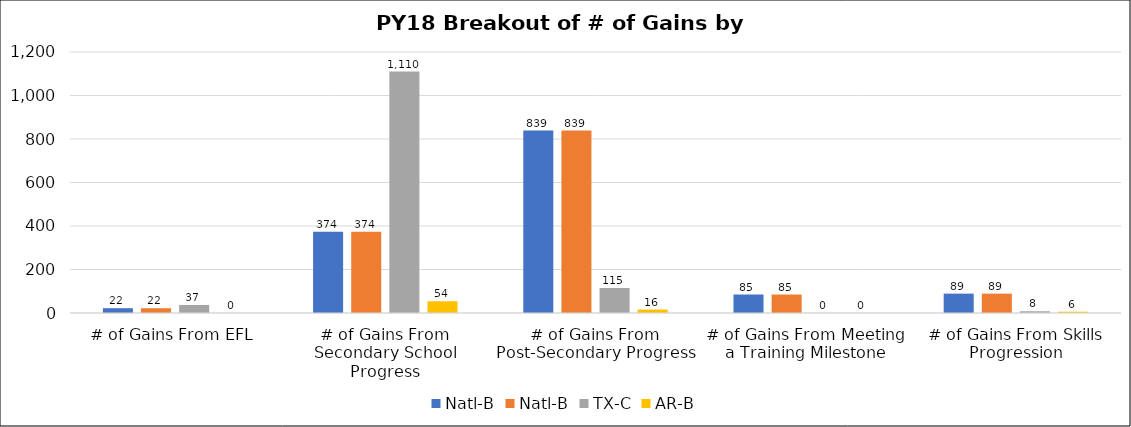
| Category | Natl-B | TX-C | AR-B |
|---|---|---|---|
| # of Gains From EFL | 22 | 37 | 0 |
| # of Gains From Secondary School Progress | 374 | 1110 | 54 |
| # of Gains From Post-Secondary Progress | 839 | 115 | 16 |
| # of Gains From Meeting a Training Milestone | 85 | 0 | 0 |
| # of Gains From Skills Progression | 89 | 8 | 6 |